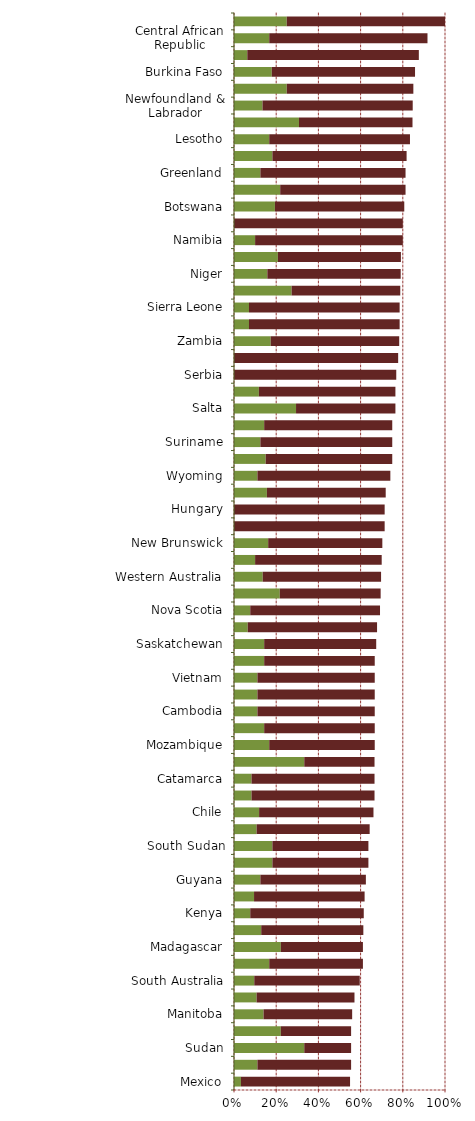
| Category |   Encourages Investment |   Not a Deterrent to Investment |
|---|---|---|
| Mexico | 0.033 | 0.517 |
| Solomon Islands | 0.111 | 0.444 |
| Sudan | 0.333 | 0.222 |
| San Juan | 0.222 | 0.333 |
| Manitoba | 0.14 | 0.42 |
| Finland | 0.107 | 0.464 |
| South Australia | 0.096 | 0.5 |
| Minnesota | 0.167 | 0.444 |
| Madagascar | 0.222 | 0.389 |
| Alberta | 0.129 | 0.484 |
| Kenya | 0.077 | 0.538 |
| Nevada | 0.095 | 0.524 |
| Guyana | 0.125 | 0.5 |
| Egypt | 0.182 | 0.455 |
| South Sudan | 0.182 | 0.455 |
| Papua New Guinea | 0.107 | 0.536 |
| Chile | 0.119 | 0.542 |
| Angola | 0.083 | 0.583 |
| Catamarca | 0.083 | 0.583 |
| Mauritania | 0.333 | 0.333 |
| Mozambique | 0.167 | 0.5 |
| South Africa | 0.143 | 0.524 |
| Cambodia | 0.111 | 0.556 |
| India | 0.111 | 0.556 |
| Vietnam | 0.111 | 0.556 |
| Norway | 0.143 | 0.524 |
| Saskatchewan | 0.143 | 0.531 |
| Ghana | 0.065 | 0.613 |
| Nova Scotia | 0.077 | 0.615 |
| Ireland | 0.217 | 0.478 |
| Western Australia | 0.136 | 0.561 |
| Laos | 0.1 | 0.6 |
| New Brunswick | 0.162 | 0.541 |
| Uruguay | 0 | 0.714 |
| Hungary | 0 | 0.714 |
| Democratic Republic of Congo (DRC) | 0.156 | 0.563 |
| Wyoming | 0.111 | 0.63 |
| Uganda | 0.15 | 0.6 |
| Suriname | 0.125 | 0.625 |
| Sweden | 0.143 | 0.607 |
| Salta | 0.294 | 0.471 |
| Eritrea | 0.118 | 0.647 |
| Serbia | 0 | 0.769 |
| Nigeria | 0 | 0.778 |
| Zambia | 0.174 | 0.609 |
| Fiji | 0.071 | 0.714 |
| Sierra Leone | 0.071 | 0.714 |
| Tanzania | 0.273 | 0.515 |
| Niger | 0.158 | 0.632 |
| Ivory Coast | 0.208 | 0.583 |
| Namibia | 0.1 | 0.7 |
| Russia | 0 | 0.8 |
| Botswana | 0.194 | 0.613 |
| Mali | 0.219 | 0.594 |
| Greenland | 0.125 | 0.688 |
| Ethiopia | 0.182 | 0.636 |
| Lesotho | 0.167 | 0.667 |
| Morocco | 0.308 | 0.538 |
| Newfoundland & Labrador | 0.135 | 0.712 |
| Guinea (Conakry) | 0.25 | 0.6 |
| Burkina Faso | 0.179 | 0.679 |
| Portugal | 0.063 | 0.813 |
| Central African Republic | 0.167 | 0.75 |
| Liberia | 0.25 | 0.75 |